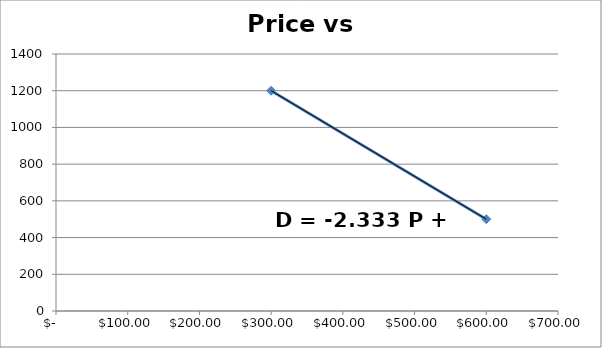
| Category | D |
|---|---|
| 600.0 | 500 |
| 300.0 | 1200 |